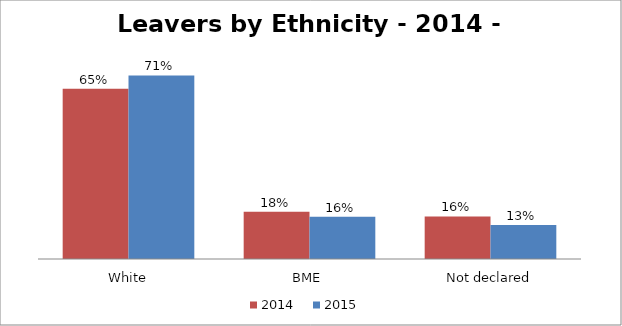
| Category | 2014
 | 2015
 |
|---|---|---|
| White | 0.655 | 0.706 |
| BME | 0.182 | 0.163 |
| Not declared | 0.164 | 0.131 |